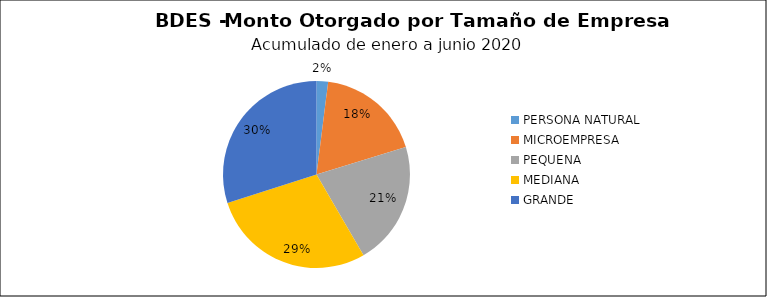
| Category | Monto | Créditos |
|---|---|---|
| PERSONA NATURAL | 1.979 | 57 |
| MICROEMPRESA | 18.092 | 3719 |
| PEQUENA | 21.163 | 465 |
| MEDIANA | 28.177 | 331 |
| GRANDE | 29.672 | 112 |